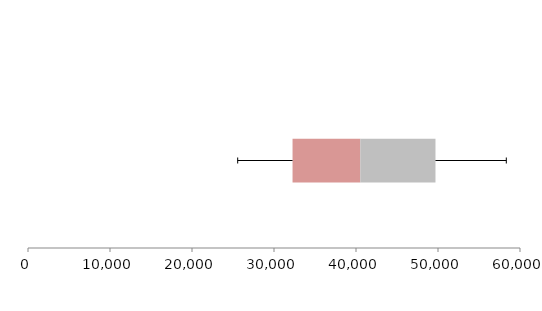
| Category | Series 1 | Series 2 | Series 3 |
|---|---|---|---|
| 0 | 32261.752 | 8260.802 | 9169.562 |